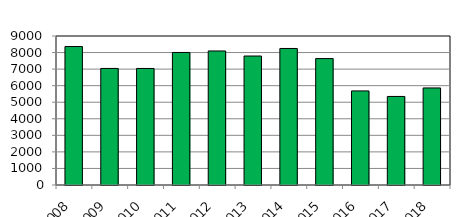
| Category | Series 1 |
|---|---|
| 2008 | 8363 |
| 2009 | 7040 |
| 2010 | 7039 |
| 2011 | 8006 |
| 2012 | 8096 |
| 2013 | 7791 |
| 2014 | 8246 |
| 2015 | 7636 |
| 2016 | 5683 |
| 2017 | 5349 |
| 2018 | 5862 |